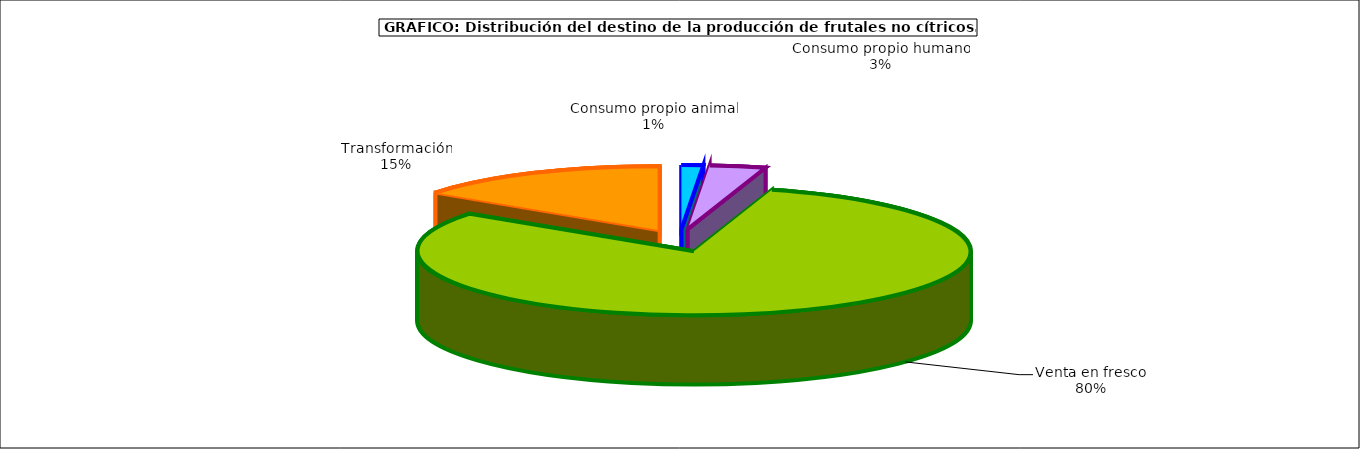
| Category | frutales no cítricos |
|---|---|
| 0 | 56273 |
| 1 | 146065 |
| 2 | 3591311 |
| 3 | 669861 |